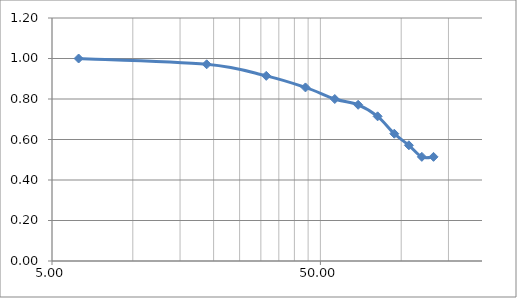
| Category | Series 0 |
|---|---|
| 6.283185307179586 | 1 |
| 18.84955592153876 | 0.971 |
| 31.41592653589793 | 0.914 |
| 43.982297150257104 | 0.857 |
| 56.548667764616276 | 0.8 |
| 69.11503837897544 | 0.771 |
| 81.68140899333463 | 0.714 |
| 94.24777960769379 | 0.629 |
| 106.81415022205297 | 0.571 |
| 119.38052083641213 | 0.514 |
| 131.94689145077132 | 0.514 |